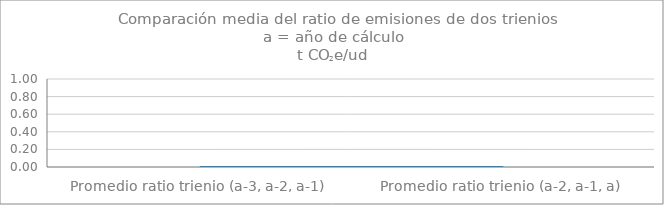
| Category | Series 1 |
|---|---|
| Promedio ratio trienio (a-3, a-2, a-1) | 0 |
| Promedio ratio trienio (a-2, a-1, a) | 0 |